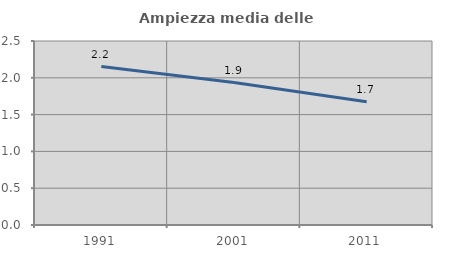
| Category | Ampiezza media delle famiglie |
|---|---|
| 1991.0 | 2.153 |
| 2001.0 | 1.936 |
| 2011.0 | 1.673 |